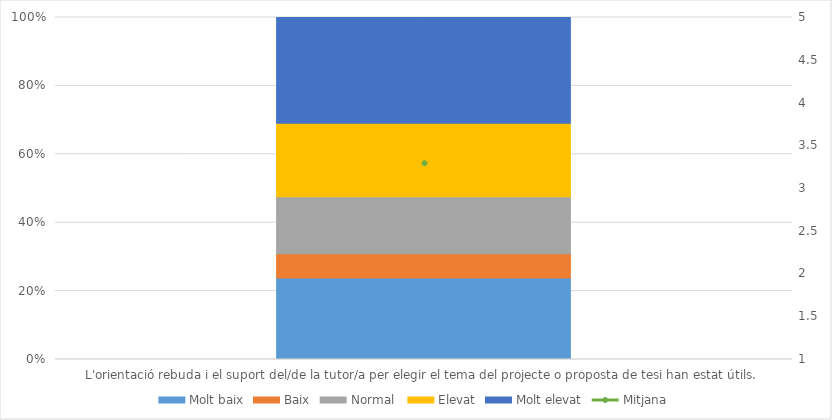
| Category | Molt baix | Baix | Normal  | Elevat | Molt elevat |
|---|---|---|---|---|---|
| L'orientació rebuda i el suport del/de la tutor/a per elegir el tema del projecte o proposta de tesi han estat útils. | 10 | 3 | 7 | 9 | 13 |